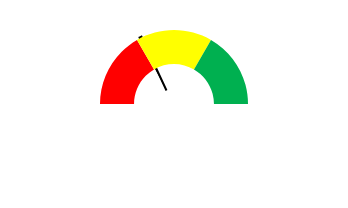
| Category | Series 1 |
|---|---|
| 0 | 21.071 |
| 1 | 1 |
| 2 | 100 |